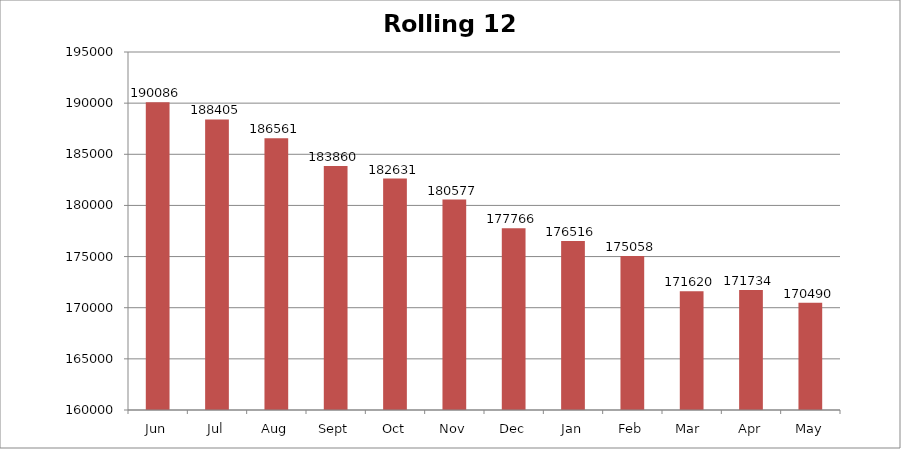
| Category | Rolling 12 Month |
|---|---|
| Jun | 190086 |
| Jul | 188405 |
| Aug | 186561 |
| Sept | 183860 |
| Oct | 182631 |
| Nov | 180577 |
| Dec | 177766 |
| Jan | 176516 |
| Feb | 175058 |
| Mar  | 171620 |
| Apr | 171734 |
| May | 170490 |